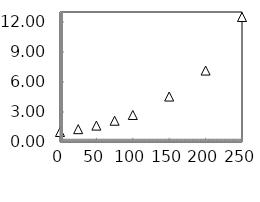
| Category | Series 2 |
|---|---|
| 0.0 | 1 |
| 25.0 | 1.282 |
| 50.0 | 1.639 |
| 75.0 | 2.128 |
| 100.0 | 2.703 |
| 150.0 | 4.545 |
| 200.0 | 7.143 |
| 250.0 | 12.5 |